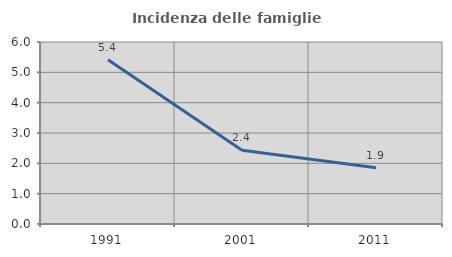
| Category | Incidenza delle famiglie numerose |
|---|---|
| 1991.0 | 5.415 |
| 2001.0 | 2.432 |
| 2011.0 | 1.855 |